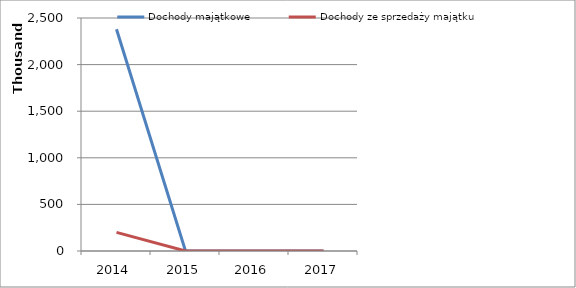
| Category | Dochody majątkowe | Dochody ze sprzedaży majątku |
|---|---|---|
| 2014.0 | 2379904 | 200000 |
| 2015.0 | 0 | 0 |
| 2016.0 | 0 | 0 |
| 2017.0 | 0 | 0 |